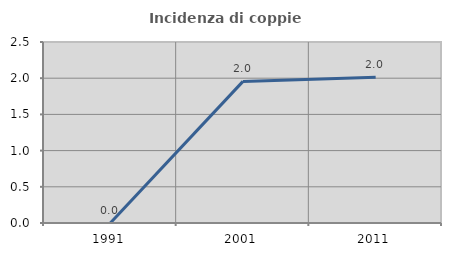
| Category | Incidenza di coppie miste |
|---|---|
| 1991.0 | 0 |
| 2001.0 | 1.956 |
| 2011.0 | 2.013 |